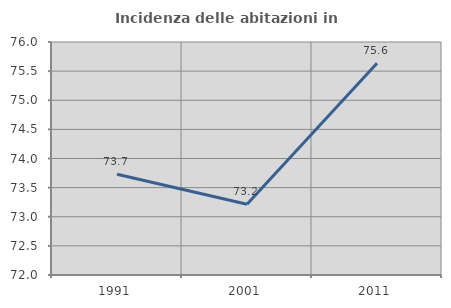
| Category | Incidenza delle abitazioni in proprietà  |
|---|---|
| 1991.0 | 73.729 |
| 2001.0 | 73.214 |
| 2011.0 | 75.636 |